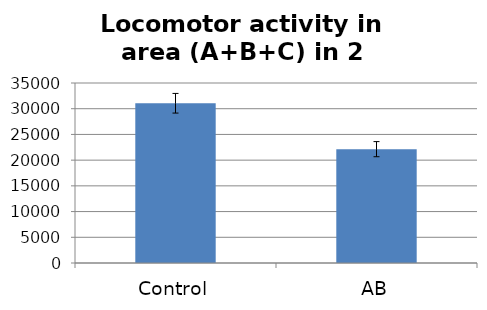
| Category | Series 0 |
|---|---|
| Control | 31063.136 |
| AB | 22135.389 |